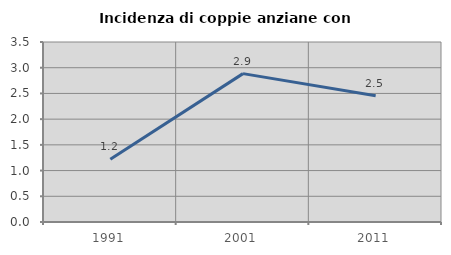
| Category | Incidenza di coppie anziane con figli |
|---|---|
| 1991.0 | 1.221 |
| 2001.0 | 2.885 |
| 2011.0 | 2.456 |